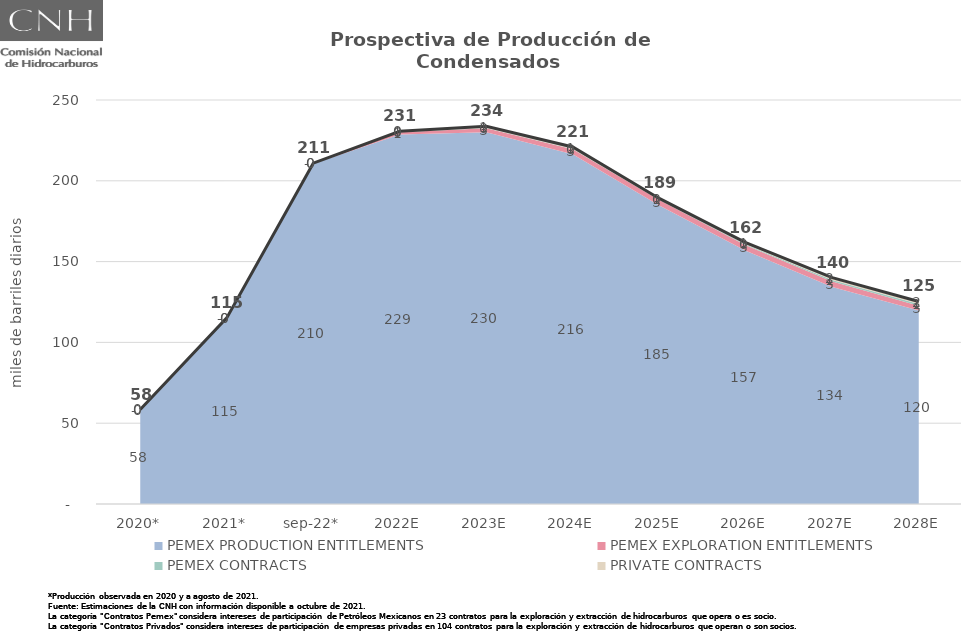
| Category | Total |
|---|---|
| 2020* | 58.421 |
| 2021* | 115.166 |
| sep-22* | 210.883 |
| 2022E | 230.623 |
| 2023E | 233.737 |
| 2024E | 220.901 |
| 2025E | 189.089 |
| 2026E | 161.79 |
| 2027E | 140.11 |
| 2028E | 125.321 |